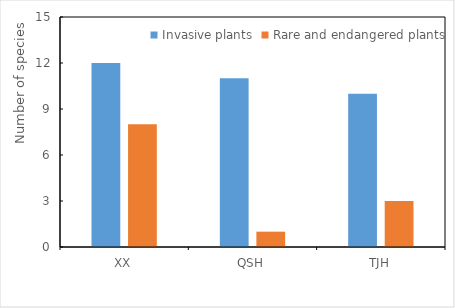
| Category | Invasive plants | Rare and endangered plants |
|---|---|---|
| XX | 12 | 8 |
| QSH | 11 | 1 |
| TJH | 10 | 3 |